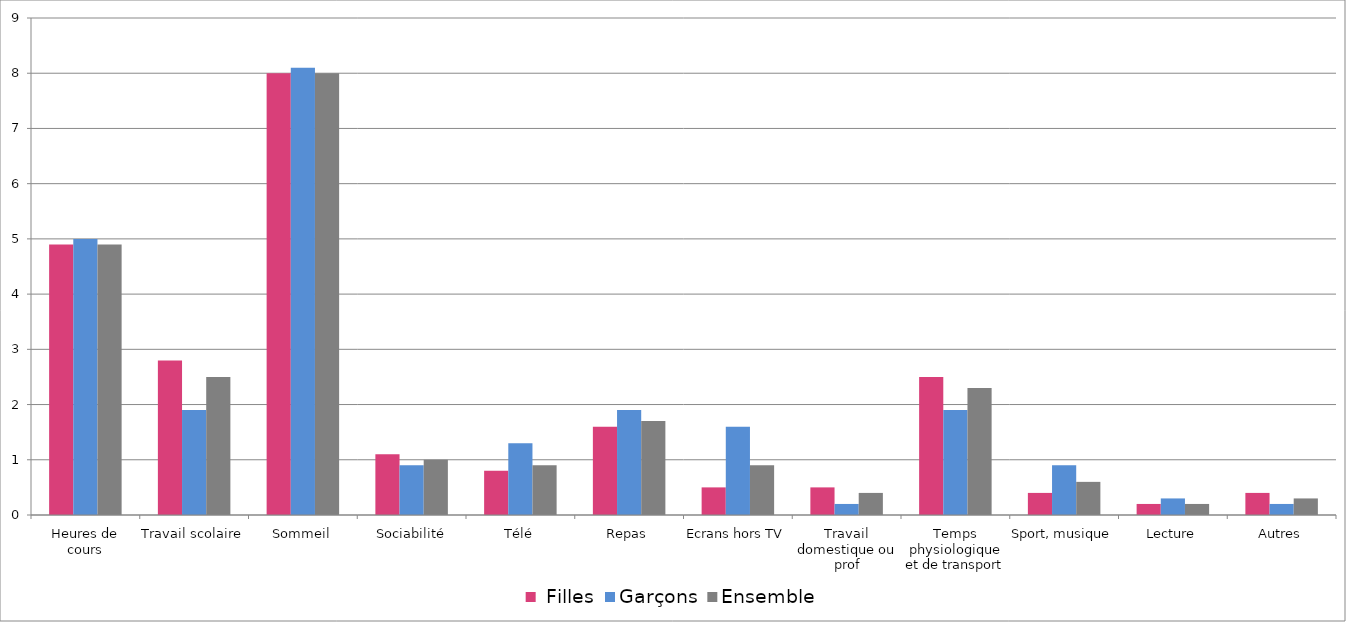
| Category |  Filles | Garçons | Ensemble |
|---|---|---|---|
| Heures de cours | 4.9 | 5 | 4.9 |
| Travail scolaire | 2.8 | 1.9 | 2.5 |
| Sommeil | 8 | 8.1 | 8 |
| Sociabilité | 1.1 | 0.9 | 1 |
| Télé | 0.8 | 1.3 | 0.9 |
| Repas | 1.6 | 1.9 | 1.7 |
| Ecrans hors TV | 0.5 | 1.6 | 0.9 |
| Travail domestique ou prof | 0.5 | 0.2 | 0.4 |
| Temps physiologique et de transport | 2.5 | 1.9 | 2.3 |
| Sport, musique | 0.4 | 0.9 | 0.6 |
| Lecture | 0.2 | 0.3 | 0.2 |
| Autres | 0.4 | 0.2 | 0.3 |